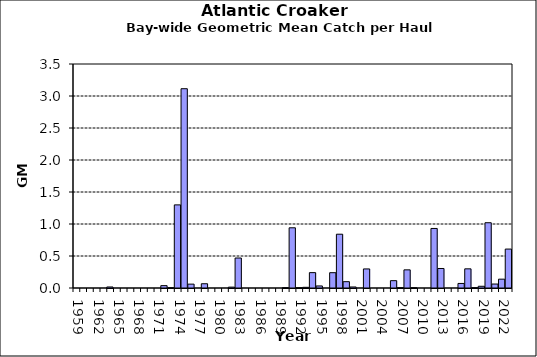
| Category | Series 0 |
|---|---|
| 1959.0 | 0 |
| 1960.0 | 0 |
| 1961.0 | 0 |
| 1962.0 | 0 |
| 1963.0 | 0 |
| 1964.0 | 0.016 |
| 1965.0 | 0 |
| 1966.0 | 0 |
| 1967.0 | 0 |
| 1968.0 | 0 |
| 1969.0 | 0 |
| 1970.0 | 0 |
| 1971.0 | 0 |
| 1972.0 | 0.037 |
| 1973.0 | 0.005 |
| 1974.0 | 1.299 |
| 1975.0 | 3.114 |
| 1976.0 | 0.06 |
| 1977.0 | 0 |
| 1978.0 | 0.066 |
| 1979.0 | 0 |
| 1980.0 | 0 |
| 1981.0 | 0 |
| 1982.0 | 0.014 |
| 1983.0 | 0.469 |
| 1984.0 | 0 |
| 1985.0 | 0 |
| 1986.0 | 0 |
| 1987.0 | 0 |
| 1988.0 | 0 |
| 1989.0 | 0 |
| 1990.0 | 0.005 |
| 1991.0 | 0.941 |
| 1992.0 | 0.005 |
| 1993.0 | 0.011 |
| 1994.0 | 0.24 |
| 1995.0 | 0.032 |
| 1996.0 | 0 |
| 1997.0 | 0.239 |
| 1998.0 | 0.841 |
| 1999.0 | 0.099 |
| 2000.0 | 0.016 |
| 2001.0 | 0 |
| 2002.0 | 0.298 |
| 2003.0 | 0 |
| 2004.0 | 0 |
| 2005.0 | 0 |
| 2006.0 | 0.115 |
| 2007.0 | 0.005 |
| 2008.0 | 0.284 |
| 2009.0 | 0.005 |
| 2010.0 | 0 |
| 2011.0 | 0 |
| 2012.0 | 0.93 |
| 2013.0 | 0.305 |
| 2014.0 | 0 |
| 2015.0 | 0 |
| 2016.0 | 0.071 |
| 2017.0 | 0.3 |
| 2018.0 | 0.005 |
| 2019.0 | 0.027 |
| 2020.0 | 1.02 |
| 2021.0 | 0.062 |
| 2022.0 | 0.138 |
| 2023.0 | 0.608 |